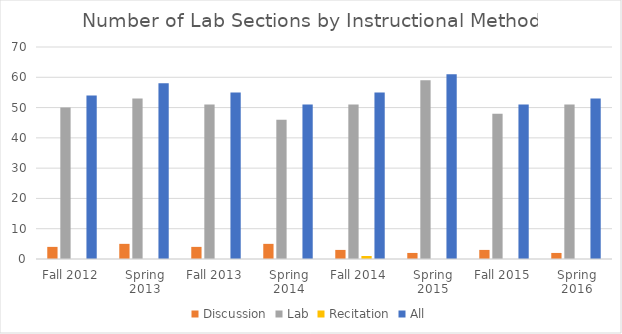
| Category | Discussion | Lab | Recitation | All |
|---|---|---|---|---|
| Fall 2012 | 4 | 50 | 0 | 54 |
| Spring 2013 | 5 | 53 | 0 | 58 |
| Fall 2013 | 4 | 51 | 0 | 55 |
| Spring 2014 | 5 | 46 | 0 | 51 |
| Fall 2014 | 3 | 51 | 1 | 55 |
| Spring 2015 | 2 | 59 | 0 | 61 |
| Fall 2015 | 3 | 48 | 0 | 51 |
| Spring 2016 | 2 | 51 | 0 | 53 |